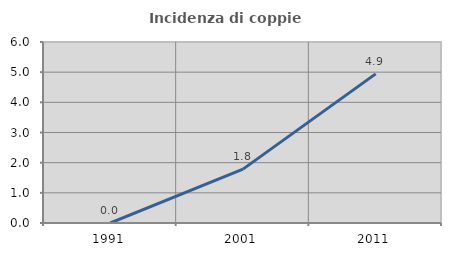
| Category | Incidenza di coppie miste |
|---|---|
| 1991.0 | 0 |
| 2001.0 | 1.786 |
| 2011.0 | 4.944 |